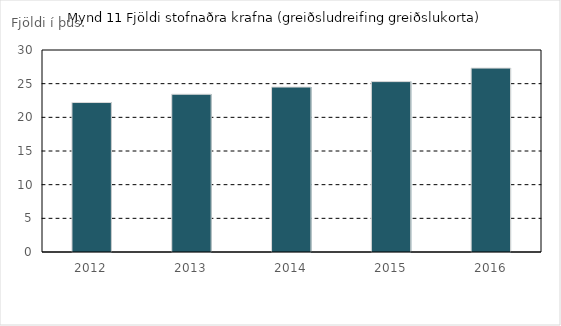
| Category | Kröfupottur |
|---|---|
| 2012.0 | 22.2 |
| 2013.0 | 23.43 |
| 2014.0 | 24.5 |
| 2015.0 | 25.306 |
| 2016.0 | 27.315 |